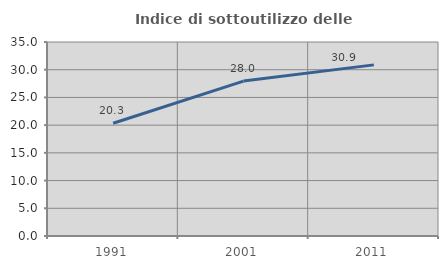
| Category | Indice di sottoutilizzo delle abitazioni  |
|---|---|
| 1991.0 | 20.338 |
| 2001.0 | 27.952 |
| 2011.0 | 30.872 |